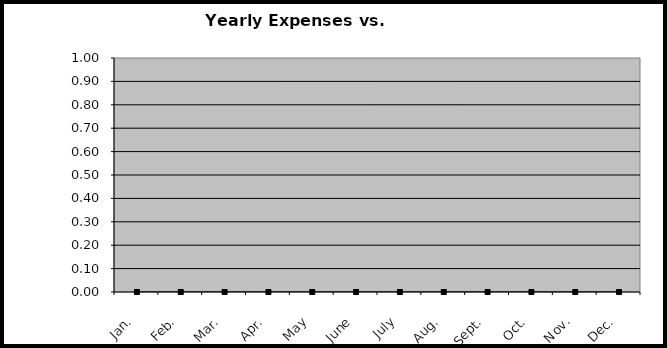
| Category | Expenses | Budget |
|---|---|---|
| Jan. | 0 | 0 |
| Feb. | 0 | 0 |
| Mar. | 0 | 0 |
| Apr. | 0 | 0 |
| May | 0 | 0 |
| June | 0 | 0 |
| July | 0 | 0 |
| Aug. | 0 | 0 |
| Sept. | 0 | 0 |
| Oct. | 0 | 0 |
| Nov. | 0 | 0 |
| Dec. | 0 | 0 |